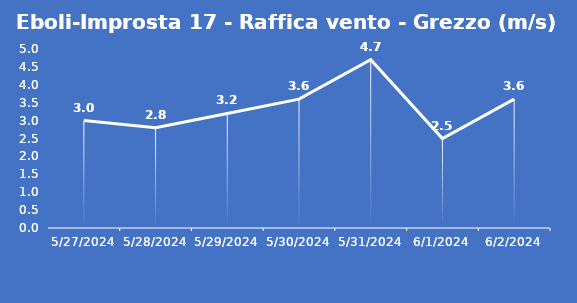
| Category | Eboli-Improsta 17 - Raffica vento - Grezzo (m/s) |
|---|---|
| 5/27/24 | 3 |
| 5/28/24 | 2.8 |
| 5/29/24 | 3.2 |
| 5/30/24 | 3.6 |
| 5/31/24 | 4.7 |
| 6/1/24 | 2.5 |
| 6/2/24 | 3.6 |